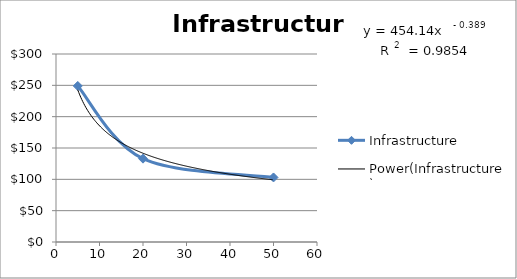
| Category | Infrastructure |
|---|---|
| 5.0 | 249 |
| 20.0 | 133 |
| 50.0 | 103 |